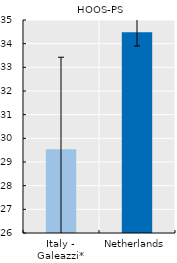
| Category | Series 0 |
|---|---|
| Italy - Galeazzi* | 29.544 |
| Netherlands | 34.478 |